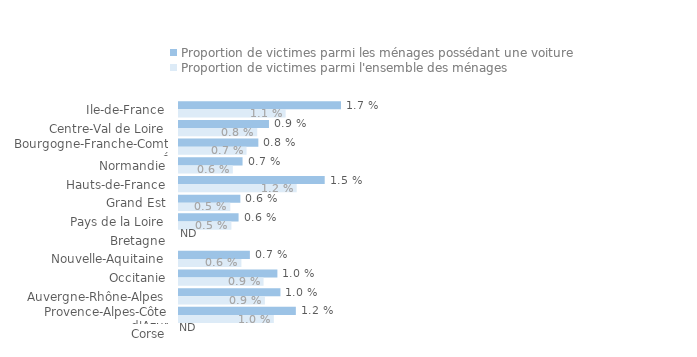
| Category | Proportion de victimes parmi les ménages possédant une voiture | Proportion de victimes parmi l'ensemble des ménages |
|---|---|---|
| Ile-de-France | 0.017 | 0.011 |
| Centre-Val de Loire | 0.009 | 0.008 |
| Bourgogne-Franche-Comté | 0.008 | 0.007 |
| Normandie | 0.007 | 0.006 |
| Hauts-de-France | 0.015 | 0.012 |
| Grand Est | 0.006 | 0.005 |
| Pays de la Loire | 0.006 | 0.005 |
| Bretagne | 0 | 0 |
| Nouvelle-Aquitaine | 0.007 | 0.006 |
| Occitanie | 0.01 | 0.009 |
| Auvergne-Rhône-Alpes | 0.01 | 0.009 |
| Provence-Alpes-Côte d'Azur | 0.012 | 0.01 |
| Corse | 0 | 0 |